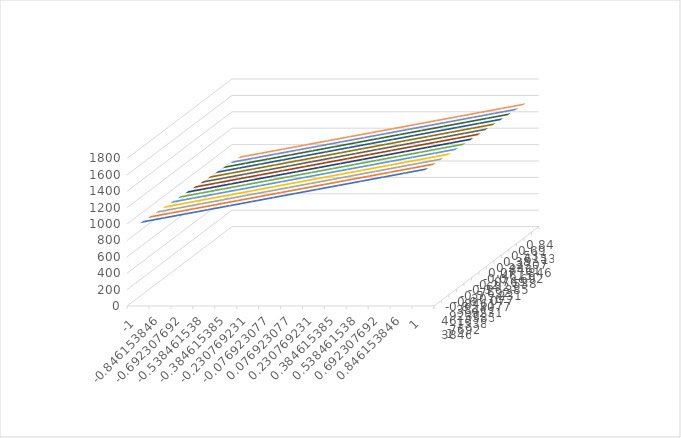
| Category | -1 | -0.846153846 | -0.692307692 | -0.538461538 | -0.384615385 | -0.230769231 | -0.076923077 | 0.076923077 | 0.230769231 | 0.384615385 | 0.538461538 | 0.692307692 | 0.846153846 | 1 |
|---|---|---|---|---|---|---|---|---|---|---|---|---|---|---|
| -1.0 | 973.654 | 965.227 | 956.8 | 948.373 | 939.947 | 931.52 | 923.093 | 914.667 | 906.24 | 897.813 | 889.387 | 880.96 | 872.533 | 864.106 |
| -0.8461538461538461 | 1023.413 | 1014.986 | 1006.559 | 998.133 | 989.706 | 981.279 | 972.853 | 964.426 | 955.999 | 947.572 | 939.146 | 930.719 | 922.292 | 913.866 |
| -0.6923076923076923 | 1073.172 | 1064.745 | 1056.319 | 1047.892 | 1039.465 | 1031.038 | 1022.612 | 1014.185 | 1005.758 | 997.332 | 988.905 | 980.478 | 972.052 | 963.625 |
| -0.5384615384615384 | 1122.931 | 1114.504 | 1106.078 | 1097.651 | 1089.224 | 1080.798 | 1072.371 | 1063.944 | 1055.518 | 1047.091 | 1038.664 | 1030.237 | 1021.811 | 1013.384 |
| -0.3846153846153846 | 1172.69 | 1164.264 | 1155.837 | 1147.41 | 1138.984 | 1130.557 | 1122.13 | 1113.703 | 1105.277 | 1096.85 | 1088.423 | 1079.997 | 1071.57 | 1063.143 |
| -0.23076923076923073 | 1222.45 | 1214.023 | 1205.596 | 1197.169 | 1188.743 | 1180.316 | 1171.889 | 1163.463 | 1155.036 | 1146.609 | 1138.182 | 1129.756 | 1121.329 | 1112.902 |
| -0.07692307692307687 | 1272.209 | 1263.782 | 1255.355 | 1246.929 | 1238.502 | 1230.075 | 1221.649 | 1213.222 | 1204.795 | 1196.368 | 1187.942 | 1179.515 | 1171.088 | 1162.662 |
| 0.07692307692307698 | 1321.968 | 1313.541 | 1305.115 | 1296.688 | 1288.261 | 1279.834 | 1271.408 | 1262.981 | 1254.554 | 1246.128 | 1237.701 | 1229.274 | 1220.847 | 1212.421 |
| 0.23076923076923084 | 1371.727 | 1363.3 | 1354.874 | 1346.447 | 1338.02 | 1329.594 | 1321.167 | 1312.74 | 1304.313 | 1295.887 | 1287.46 | 1279.033 | 1270.607 | 1262.18 |
| 0.3846153846153847 | 1421.486 | 1413.06 | 1404.633 | 1396.206 | 1387.779 | 1379.353 | 1370.926 | 1362.499 | 1354.073 | 1345.646 | 1337.219 | 1328.793 | 1320.366 | 1311.939 |
| 0.5384615384615385 | 1471.246 | 1462.819 | 1454.392 | 1445.965 | 1437.539 | 1429.112 | 1420.685 | 1412.259 | 1403.832 | 1395.405 | 1386.978 | 1378.552 | 1370.125 | 1361.698 |
| 0.6923076923076924 | 1521.005 | 1512.578 | 1504.151 | 1495.725 | 1487.298 | 1478.871 | 1470.444 | 1462.018 | 1453.591 | 1445.164 | 1436.738 | 1428.311 | 1419.884 | 1411.458 |
| 0.8461538461538463 | 1570.764 | 1562.337 | 1553.91 | 1545.484 | 1537.057 | 1528.63 | 1520.204 | 1511.777 | 1503.35 | 1494.924 | 1486.497 | 1478.07 | 1469.643 | 1461.217 |
| 1.0 | 1620.523 | 1612.096 | 1603.67 | 1595.243 | 1586.816 | 1578.39 | 1569.963 | 1561.536 | 1553.109 | 1544.683 | 1536.256 | 1527.829 | 1519.403 | 1510.976 |